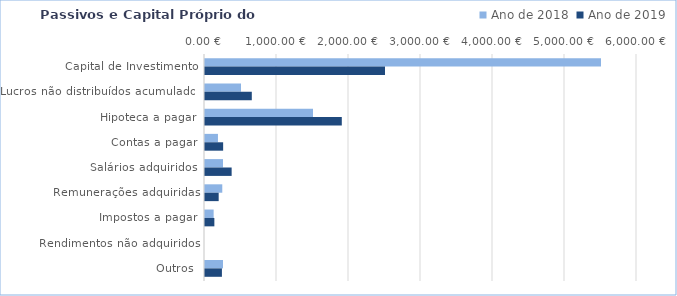
| Category | Ano de 2018 | Ano de 2019 |
|---|---|---|
| Capital de Investimento | 5500 | 2500 |
| Lucros não distribuídos acumulados | 500 | 650 |
| Hipoteca a pagar | 1500 | 1900 |
| Contas a pagar | 180 | 252 |
| Salários adquiridos | 250 | 370 |
| Remunerações adquiridas | 240 | 190 |
| Impostos a pagar | 120 | 130 |
| Rendimentos não adquiridos | 0 | 0 |
| Outros | 250 | 235 |